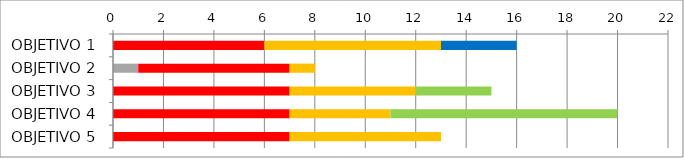
| Category | Series 1 | Series 2 | Series 3 | Series 4 | Series 5 |
|---|---|---|---|---|---|
| OBJETIVO 1 | 0 | 6 | 7 | 0 | 3 |
| OBJETIVO 2 | 1 | 6 | 1 | 0 | 0 |
| OBJETIVO 3 | 0 | 7 | 5 | 3 | 0 |
| OBJETIVO 4 | 0 | 7 | 4 | 9 | 0 |
| OBJETIVO 5 | 0 | 7 | 6 | 0 | 0 |